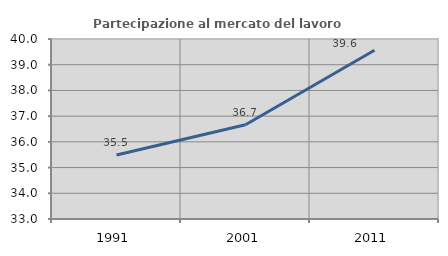
| Category | Partecipazione al mercato del lavoro  femminile |
|---|---|
| 1991.0 | 35.491 |
| 2001.0 | 36.667 |
| 2011.0 | 39.56 |